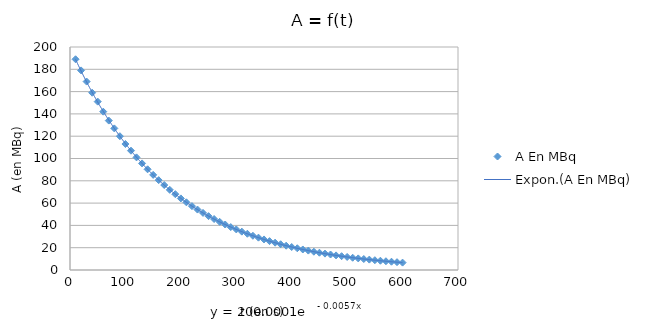
| Category | A |
|---|---|
| 10.0 | 189 |
| 20.0 | 179 |
| 30.0 | 169 |
| 40.0 | 159 |
| 50.0 | 151 |
| 60.0 | 142 |
| 70.0 | 134 |
| 80.0 | 127 |
| 90.0 | 120 |
| 100.0 | 113 |
| 110.0 | 107 |
| 120.0 | 101 |
| 130.0 | 95.6 |
| 140.0 | 90.3 |
| 150.0 | 85.3 |
| 160.0 | 80.6 |
| 170.0 | 76.2 |
| 180.0 | 71.9 |
| 190.0 | 68 |
| 200.0 | 64.2 |
| 210.0 | 60.7 |
| 220.0 | 57.3 |
| 230.0 | 54.2 |
| 240.0 | 51.2 |
| 250.0 | 48.3 |
| 260.0 | 45.7 |
| 270.0 | 43.2 |
| 280.0 | 40.8 |
| 290.0 | 38.5 |
| 300.0 | 36.4 |
| 310.0 | 34.4 |
| 320.0 | 32.5 |
| 330.0 | 30.7 |
| 340.0 | 29 |
| 350.0 | 27.4 |
| 360.0 | 25.9 |
| 370.0 | 24.5 |
| 380.0 | 23.1 |
| 390.0 | 21.8 |
| 400.0 | 20.6 |
| 410.0 | 19.5 |
| 420.0 | 18.4 |
| 430.0 | 17.4 |
| 440.0 | 16.4 |
| 450.0 | 15.5 |
| 460.0 | 14.7 |
| 470.0 | 13.9 |
| 480.0 | 13.1 |
| 490.0 | 12.4 |
| 500.0 | 11.7 |
| 510.0 | 11 |
| 520.0 | 10.4 |
| 530.0 | 9.85 |
| 540.0 | 9.31 |
| 550.0 | 8.8 |
| 560.0 | 8.31 |
| 570.0 | 7.85 |
| 580.0 | 7.42 |
| 590.0 | 7.01 |
| 600.0 | 6.62 |